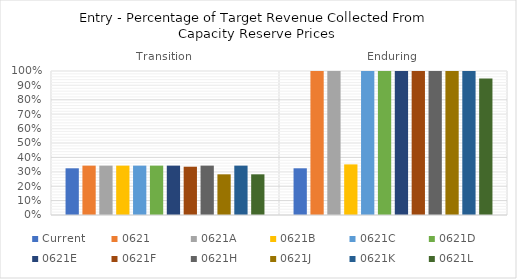
| Category | Current | 0621 | 0621A | 0621B | 0621C | 0621D | 0621E | 0621F | 0621H | 0621J | 0621K | 0621L |
|---|---|---|---|---|---|---|---|---|---|---|---|---|
| Transition | 0.324 | 0.343 | 0.343 | 0.343 | 0.343 | 0.343 | 0.343 | 0.335 | 0.343 | 0.282 | 0.343 | 0.282 |
| Enduring | 0.324 | 1 | 1 | 0.351 | 1 | 1 | 1 | 1 | 1 | 1 | 1 | 0.948 |